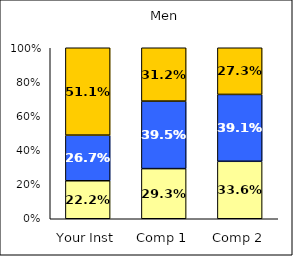
| Category | Low Habits of Mind | Average Habits of Mind | High Habits of Mind |
|---|---|---|---|
| Your Inst | 0.222 | 0.267 | 0.511 |
| Comp 1 | 0.293 | 0.395 | 0.312 |
| Comp 2 | 0.336 | 0.391 | 0.273 |